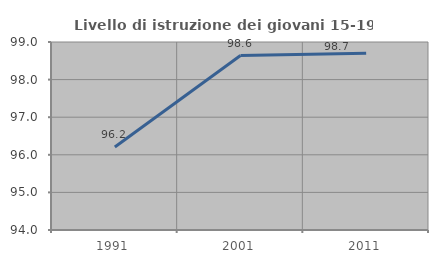
| Category | Livello di istruzione dei giovani 15-19 anni |
|---|---|
| 1991.0 | 96.209 |
| 2001.0 | 98.639 |
| 2011.0 | 98.701 |